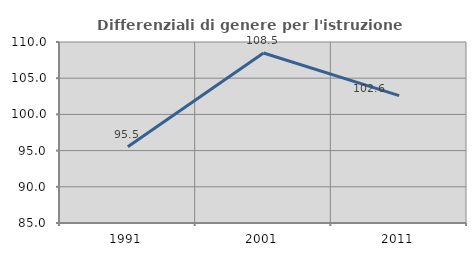
| Category | Differenziali di genere per l'istruzione superiore |
|---|---|
| 1991.0 | 95.524 |
| 2001.0 | 108.475 |
| 2011.0 | 102.6 |